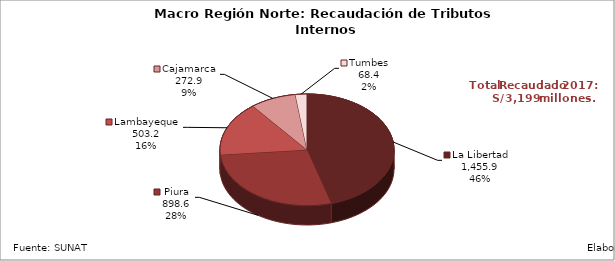
| Category | Series 0 |
|---|---|
| La Libertad | 1455.88 |
| Piura | 898.586 |
| Lambayeque | 503.208 |
| Cajamarca | 272.853 |
| Tumbes | 68.433 |